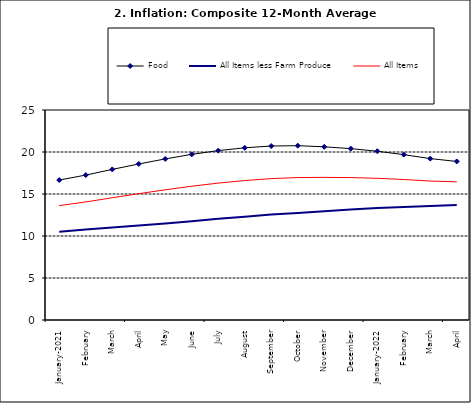
| Category | Food | All Items less Farm Produce | All Items |
|---|---|---|---|
| January-2021 | 16.662 | 10.519 | 13.616 |
| February | 17.251 | 10.767 | 14.053 |
| March | 17.929 | 11.015 | 14.554 |
| April | 18.576 | 11.247 | 15.039 |
| May | 19.176 | 11.502 | 15.499 |
| June | 19.721 | 11.75 | 15.927 |
| July | 20.165 | 12.052 | 16.298 |
| August | 20.499 | 12.291 | 16.601 |
| September | 20.711 | 12.553 | 16.83 |
| October | 20.753 | 12.725 | 16.958 |
| November | 20.619 | 12.956 | 16.979 |
| December | 20.403 | 13.161 | 16.953 |
| January-2022 | 20.089 | 13.326 | 16.869 |
| February | 19.687 | 13.461 | 16.728 |
| March | 19.214 | 13.562 | 16.544 |
| April | 18.876 | 13.681 | 16.449 |